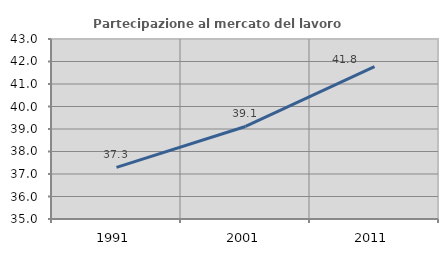
| Category | Partecipazione al mercato del lavoro  femminile |
|---|---|
| 1991.0 | 37.292 |
| 2001.0 | 39.113 |
| 2011.0 | 41.771 |